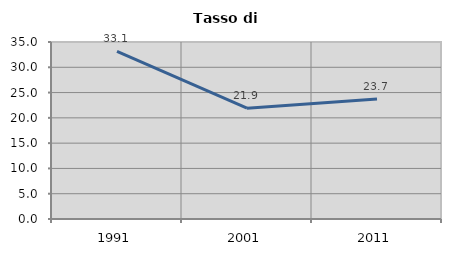
| Category | Tasso di disoccupazione   |
|---|---|
| 1991.0 | 33.146 |
| 2001.0 | 21.918 |
| 2011.0 | 23.741 |